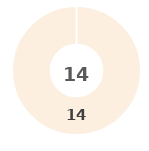
| Category | Series 0 |
|---|---|
| 0 | 0 |
| 1 | 0 |
| 2 | 0 |
| 3 | 0 |
| 4 | 14 |